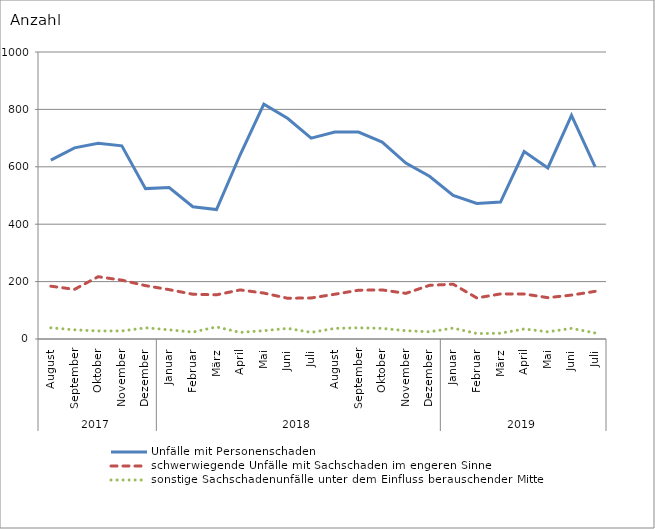
| Category | Unfälle mit Personenschaden | schwerwiegende Unfälle mit Sachschaden im engeren Sinne | sonstige Sachschadenunfälle unter dem Einfluss berauschender Mittel |
|---|---|---|---|
| 0 | 623 | 184 | 39 |
| 1 | 666 | 173 | 32 |
| 2 | 682 | 217 | 28 |
| 3 | 673 | 205 | 28 |
| 4 | 524 | 186 | 39 |
| 5 | 528 | 172 | 32 |
| 6 | 461 | 156 | 24 |
| 7 | 451 | 154 | 42 |
| 8 | 642 | 171 | 23 |
| 9 | 818 | 160 | 29 |
| 10 | 769 | 142 | 37 |
| 11 | 700 | 143 | 23 |
| 12 | 721 | 156 | 37 |
| 13 | 721 | 170 | 39 |
| 14 | 686 | 171 | 37 |
| 15 | 613 | 159 | 29 |
| 16 | 567 | 187 | 25 |
| 17 | 500 | 191 | 38 |
| 18 | 472 | 143 | 19 |
| 19 | 477 | 157 | 20 |
| 20 | 653 | 157 | 35 |
| 21 | 596 | 144 | 25 |
| 22 | 779 | 153 | 37 |
| 23 | 600 | 166 | 21 |